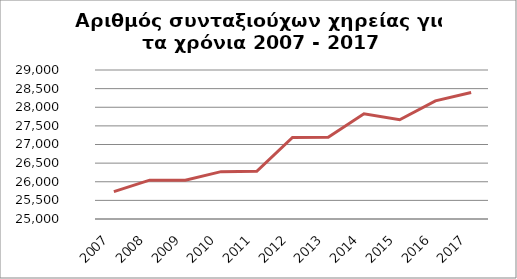
| Category | Series 1 |
|---|---|
| 2007.0 | 25735 |
| 2008.0 | 26043 |
| 2009.0 | 26039 |
| 2010.0 | 26271 |
| 2011.0 | 26279 |
| 2012.0 | 27190 |
| 2013.0 | 27194 |
| 2014.0 | 27824 |
| 2015.0 | 27663 |
| 2016.0 | 28173 |
| 2017.0 | 28398 |